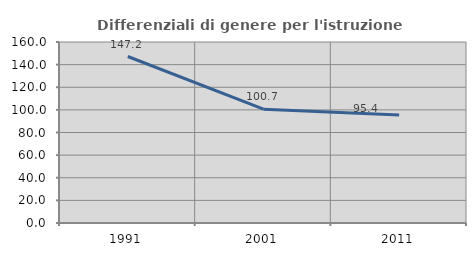
| Category | Differenziali di genere per l'istruzione superiore |
|---|---|
| 1991.0 | 147.163 |
| 2001.0 | 100.655 |
| 2011.0 | 95.377 |